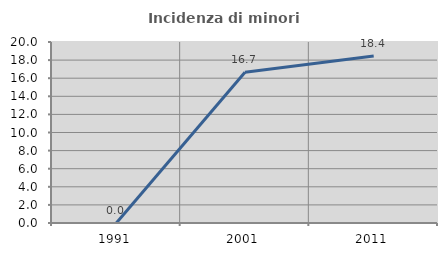
| Category | Incidenza di minori stranieri |
|---|---|
| 1991.0 | 0 |
| 2001.0 | 16.667 |
| 2011.0 | 18.447 |